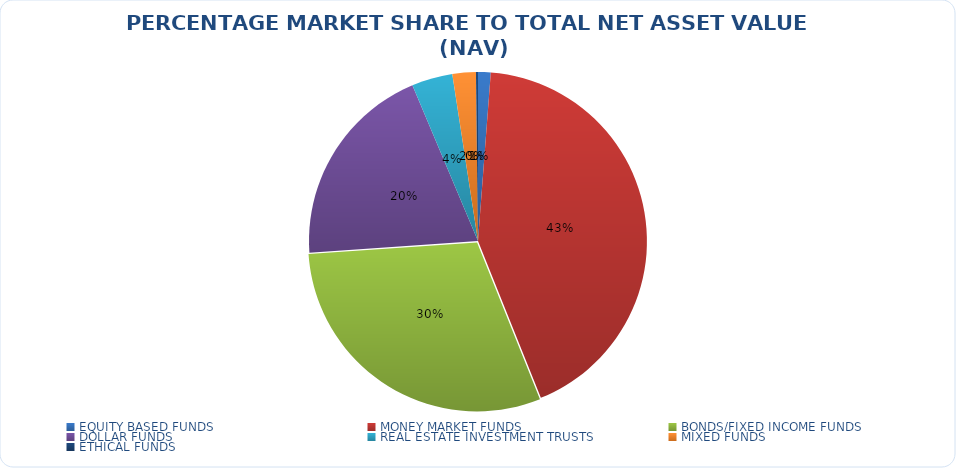
| Category | NET ASSET VALUE |
|---|---|
| EQUITY BASED FUNDS | 15480906263.62 |
| MONEY MARKET FUNDS | 548165339384.66 |
| BONDS/FIXED INCOME FUNDS | 384428914391.67 |
| DOLLAR FUNDS | 253508946774.555 |
| REAL ESTATE INVESTMENT TRUSTS | 50148775654.72 |
| MIXED FUNDS | 28733678459.418 |
| ETHICAL FUNDS | 2481540392.43 |